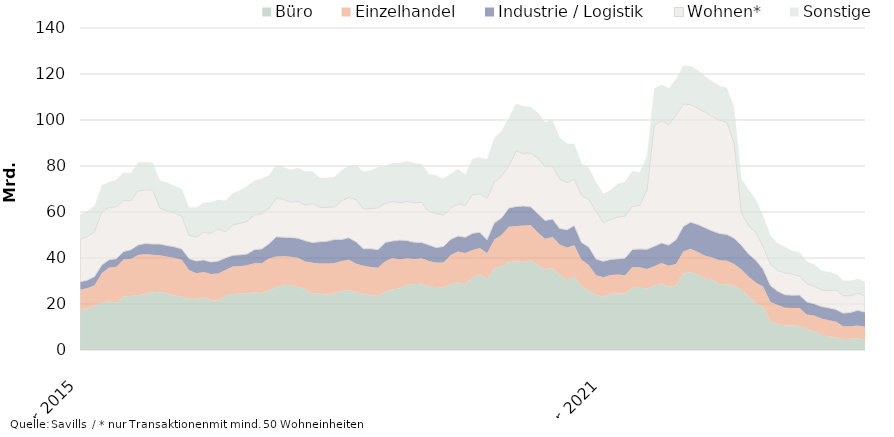
| Category | Büro | Einzelhandel | Industrie / Logistik | Wohnen* | Sonstige |
|---|---|---|---|---|---|
| 2015-03-01 | 17016358031.53 | 9334060176.81 | 3368654245.73 | 18361690467.91 | 10843377202.98 |
| 2015-04-01 | 18244972783.53 | 8600759739.81 | 3468694360.68 | 18935039794.91 | 11184131034.98 |
| 2015-05-01 | 19238000474.45 | 8936850539.31 | 3728635607.68 | 19506582676.91 | 11229798527.98 |
| 2015-06-01 | 20614824085.83 | 12804218553.14 | 3559231021.83 | 23077039312.51 | 11574720193.75 |
| 2015-07-01 | 21080237533.5 | 14814698989.21 | 3371725415.86 | 22644697118.35 | 11143910205.21 |
| 2015-08-01 | 20656625633.5 | 15562941505.21 | 3450767146.86 | 22691607883.35 | 11626767372.21 |
| 2015-09-01 | 23302273453.46 | 16001092585.73 | 3520511283.36 | 22121631489.35 | 12279196997.21 |
| 2015-10-01 | 23501772857.46 | 16181040556.36 | 3919085482.36 | 21349455176.35 | 11987539478.21 |
| 2015-11-01 | 23957423619.14 | 17339041737.5 | 4397719316.13 | 23451887702.29 | 12443601394.38 |
| 2015-12-01 | 24202213697.48 | 17587198961.04 | 4557113724.92 | 23375825542.77 | 11975940305.75 |
| 2016-01-01 | 25139700628.48 | 16270997225.45 | 4662502872.92 | 23334161447.77 | 12028959045.24 |
| 2016-02-01 | 25294714349.53 | 15952090497.99 | 4833139363.87 | 15563498654.77 | 12008953720.01 |
| 2016-03-01 | 24534844202.74 | 15997699828.72 | 4877967507.07 | 15108592339.77 | 12318880326.08 |
| 2016-04-01 | 23667928105.74 | 16386770286.07 | 4833846127.82 | 14760671477.37 | 11756957541.08 |
| 2016-05-01 | 23251081507.82 | 15941944380.07 | 4749671116.82 | 14232081715.37 | 11979556735.04 |
| 2016-06-01 | 22424129844.36 | 12364494883.06 | 4999570420.67 | 10189436595.87 | 12067576140.06 |
| 2016-07-01 | 22113990925.69 | 11257435985.56 | 5312245465.64 | 10404072475.53 | 12817090834.96 |
| 2016-08-01 | 23020503074.69 | 10878738868.56 | 5247332254.55 | 12050427222.53 | 12924367433.96 |
| 2016-09-01 | 21721152253.73 | 11278501725.47 | 5270185116.55 | 12498985369.53 | 13466325785.26 |
| 2016-10-01 | 21376679446.86 | 11872308168.84 | 5398267322.55 | 14009495152.42 | 12815064855.83 |
| 2016-11-01 | 23418913086.76 | 11371816740.7 | 5243284144.73 | 11319606979.49 | 13584628478.66 |
| 2016-12-01 | 24311240228.4 | 11942470429.99 | 4890351002.13 | 13270662270.49 | 13860642419.64 |
| 2017-01-01 | 24509608793.4 | 11953863686.96 | 4924744810.37 | 13669156871.49 | 14439441490.58 |
| 2017-02-01 | 24522929822.41 | 12378572437.09 | 4842785725 | 14207318507.49 | 15399823383.58 |
| 2017-03-01 | 24979801711.4 | 12787832178.37 | 5899654543.8 | 15107380846.79 | 14961863124.58 |
| 2017-04-01 | 24819990861.71 | 12853010576.9 | 6262060580.1 | 15428575157.19 | 15066124285.67 |
| 2017-05-01 | 26232596283.47 | 13514985630.15 | 6483702097.1 | 15461747545.2 | 14297593389.28 |
| 2017-06-01 | 27213166704.1 | 13474043478.5 | 8562546401.46 | 16748341270.79 | 14470141007.56 |
| 2017-07-01 | 28420051498.1 | 12322239347.93 | 8324132158.46 | 16426846580.79 | 13950696505.2 |
| 2017-08-01 | 28135534177.1 | 12429029136.93 | 8386695707.55 | 15389020182.79 | 13979801046.2 |
| 2017-09-01 | 27443892685.45 | 12637830917.94 | 8510058041.55 | 16036484989.78 | 14628427847.74 |
| 2017-10-01 | 26496035870.32 | 11930960273.94 | 9048046430.46 | 15587099126.87 | 14494347450.17 |
| 2017-11-01 | 24585217292.17 | 13335421843.83 | 8802947546.51 | 16954725036.87 | 13991797246.44 |
| 2017-12-01 | 24440717997.53 | 13186078236.48 | 9470343512.7 | 14947735472.87 | 12875205655.48 |
| 2018-01-01 | 24169632440.53 | 13385637745.1 | 9721702683.46 | 14644481680.86 | 12965625420.04 |
| 2018-02-01 | 24532655677.47 | 13346974130.65 | 10213193365.46 | 14254040308.86 | 12991286516.04 |
| 2018-03-01 | 25689146433.48 | 13025014136.64 | 9307934893.46 | 16861797743.49 | 13423676924.02 |
| 2018-04-01 | 26121570226.17 | 13083782210.76 | 9605919650.46 | 17541166648.49 | 13812859535.93 |
| 2018-05-01 | 25059149940.41 | 12454100846.51 | 9488564046.46 | 18390492426.48 | 14988664801.36 |
| 2018-06-01 | 24502115752.78 | 12171900363.34 | 7330050155.1 | 17324340647.56 | 16180804689.08 |
| 2018-07-01 | 23768042590.78 | 12322300226.32 | 7966869588.1 | 17450608751.56 | 16672007493.19 |
| 2018-08-01 | 23510045994.76 | 12247139005.19 | 7892000709.1 | 18148274126.41 | 17798374873.04 |
| 2018-09-01 | 25341157455.41 | 13289291079.55 | 8129841438.1 | 16962704659.42 | 16165594775.21 |
| 2018-10-01 | 26253931201.41 | 13760202882.82 | 7406435586.25 | 17174676866.32 | 16705006538.21 |
| 2018-11-01 | 26888009103.45 | 12507346034.88 | 8394898728.54 | 16108073420.32 | 17423267492.25 |
| 2018-12-01 | 28411133671.45 | 11512722354.68 | 7666795490.35 | 16973956914.32 | 17659710774.26 |
| 2019-01-01 | 28624375832.45 | 10984616615.68 | 7214323719.35 | 17160274095.2 | 17313329869.26 |
| 2019-02-01 | 28937833501.45 | 10992187442.4 | 6831262259.96 | 17513522042.2 | 16557159059.62 |
| 2019-03-01 | 27544432810.45 | 11171202657.26 | 6985219187.16 | 14474272923.27 | 16426926447.64 |
| 2019-04-01 | 27372510768.31 | 10721779269.12 | 6436402186.06 | 14889885528.14 | 16464762534.89 |
| 2019-05-01 | 27086717264.31 | 11007377577.12 | 6927571752.06 | 13578486873.14 | 15944373230.89 |
| 2019-06-01 | 28619667307.82 | 12681145920.09 | 6809920057.06 | 13618351757.47 | 14918333741.96 |
| 2019-07-01 | 29482520307.29 | 13328276761.26 | 6728675032.06 | 14001371322.47 | 15123984896.92 |
| 2019-08-01 | 28588686723.31 | 13581005313.39 | 6860393893.06 | 13736815812.62 | 13482843208.07 |
| 2019-09-01 | 31431753528.25 | 12033999494.97 | 7256389082.92 | 16844554255.62 | 15592958025.83 |
| 2019-10-01 | 32996593890.25 | 11314584887.7 | 6895687562.55 | 16686604858.74 | 15889399476.83 |
| 2019-11-01 | 30747652297.78 | 11283623755.75 | 5893842897.79 | 18035429153.74 | 16938532442.52 |
| 2019-12-01 | 35333825929.49 | 12729233930.88 | 7226755920.45 | 17719972058.74 | 19305302136.48 |
| 2020-01-01 | 36531141461.49 | 13436003498.88 | 7453434361.23 | 18157224812.87 | 19678778754.48 |
| 2020-02-01 | 38099058525.44 | 15499382207.37 | 8153950247.38 | 18363765931.37 | 20828827891.2 |
| 2020-03-01 | 38550852731.89 | 15348353698.15 | 8470739173.18 | 24050048197.37 | 20802783298.78 |
| 2020-04-01 | 38270850851.03 | 15863227930.17 | 8454767344.28 | 22908106646.5 | 20458776349.53 |
| 2020-05-01 | 38881659487.03 | 15503798044.17 | 7865864944.28 | 23336096487.5 | 20137314225.49 |
| 2020-06-01 | 36863967238.52 | 14249892871.21 | 8180845859.28 | 24099048462.5 | 19760014318.42 |
| 2020-07-01 | 35100846656.05 | 13289221607.06 | 7897157112.28 | 23512544941.5 | 19250334168.72 |
| 2020-08-01 | 35666705693.05 | 13410315043.06 | 7903742159.28 | 23019438157.5 | 20371509500.21 |
| 2020-09-01 | 32548010965.11 | 13308117743.68 | 6993249103.42 | 21488103702.49 | 18050626536.08 |
| 2020-10-01 | 30377863654.11 | 14232141322.68 | 7652755535.73 | 20471023725.49 | 17086798953.54 |
| 2020-11-01 | 32272707606.11 | 13317837196.68 | 8500880007.2 | 20188542385.49 | 15400933573.98 |
| 2020-12-01 | 27625165021.4 | 11665823550.74 | 7453393031.54 | 20611432435.49 | 13802815932.88 |
| 2021-01-01 | 25922292644.4 | 11086279196.74 | 7788343257.76 | 20716309315.49 | 13816564859.79 |
| 2021-02-01 | 23909270226.45 | 8616945364.53 | 7050296261 | 20712784697.99 | 12611658548.47 |
| 2021-03-01 | 23103754308 | 8542709511.89 | 6901126684.99 | 16854834848.99 | 12571457775.25 |
| 2021-04-01 | 24445734490 | 8172892560.01 | 6780450405.99 | 17402809013.99 | 12787391550.25 |
| 2021-05-01 | 24556778258 | 8300675545.01 | 6799570666.99 | 18167126016.99 | 14426521004.29 |
| 2021-06-01 | 24564712115 | 7976784992 | 7442419746.99 | 18226182212.99 | 14893365800.91 |
| 2021-07-01 | 27096908880 | 8946495241 | 7685665984.99 | 18785811487.74 | 15380416702.54 |
| 2021-08-01 | 27381485355 | 8588029166 | 7973074710.96 | 18901381563.74 | 14374250615.05 |
| 2021-09-01 | 26583833618 | 8673767815.91 | 8545495709.96 | 25629322018.75 | 14806322793.41 |
| 2021-10-01 | 27976146105.69 | 8385660425.91 | 8750582399.96 | 52501286139.75 | 16203607137.32 |
| 2021-11-01 | 28869809103.69 | 8903617601.91 | 8755552913.96 | 53116738980.75 | 15682010779.88 |
| 2021-12-01 | 27486490912.69 | 9091146920.86 | 9058724684.96 | 52306052488.25 | 15911718226.98 |
| 2022-01-01 | 28031135110.69 | 9315774980.07 | 10564640071.97 | 54152314759.25 | 15815971210.07 |
| 2022-02-01 | 33207067958.24 | 9592118324.13 | 10884960143.97 | 53241290616.79 | 16686139999.17 |
| 2022-03-01 | 33946785395.27 | 10065682922.43 | 11570573114.93 | 51107123050.79 | 16747285170.48 |
| 2022-04-01 | 32664499595.27 | 9945157957.43 | 11993854151.93 | 50503999418.79 | 16663945475.48 |
| 2022-05-01 | 31125193747.27 | 9878526536.43 | 12156046280.93 | 50270647458.79 | 15528955696.48 |
| 2022-06-01 | 30599994788.74 | 9654726857.42 | 11522419839.93 | 49707368541.79 | 15318436387.32 |
| 2022-07-01 | 28678258351.74 | 10395369164.8 | 11552338908.93 | 49231995043.04 | 15001577672.32 |
| 2022-08-01 | 28623980028.74 | 10186491398.8 | 11445785093.96 | 48711417034.02 | 15034757196.32 |
| 2022-09-01 | 27784288953.74 | 9632330188.89 | 11196978657.96 | 41148135072.17 | 15807249733.27 |
| 2022-10-01 | 26111579119.05 | 8901542364.89 | 10532370813.96 | 14109575596.17 | 14768461087.88 |
| 2022-11-01 | 23352831057.49 | 8443326908.89 | 9881801612.96 | 12298496042.17 | 15703391925.8 |
| 2022-12-01 | 20211163559.49 | 9142239345.94 | 9652007449.94 | 12150611492.67 | 14213710249.84 |
| 2023-01-01 | 18780895172.49 | 8725890743.73 | 7496504559.93 | 9699649565.65 | 13433592381.84 |
| 2023-02-01 | 12490315896.94 | 8415580292.67 | 7078973358.93 | 9335553360.11 | 12411037027.98 |
| 2023-03-01 | 11256081460.91 | 8315622099.37 | 6010959284.98 | 9054825734.11 | 11767948193.31 |
| 2023-04-01 | 10683362085.91 | 7669045935.37 | 5665394287.98 | 9530698016.53 | 11246523542.31 |
| 2023-05-01 | 10633502484.91 | 7618861499.37 | 5603325227.98 | 9108479222.53 | 10177566551.31 |
| 2023-06-01 | 10294412987.44 | 8003181317.37 | 5581733960.95 | 8245407543.53 | 10389655265.85 |
| 2023-07-01 | 9257206588.44 | 6139595299.99 | 5472679568.92 | 7958623413.29 | 9675339565.85 |
| 2023-08-01 | 8110622411.44 | 6904398653.29 | 5117810292.92 | 7641044836.31 | 9428000534.85 |
| 2023-09-01 | 6677025956.44 | 7009806136.29 | 5231318723.92 | 7259636172.16 | 8531149970.9 |
| 2023-10-01 | 5989961773.44 | 6960796772.29 | 5411649029.9 | 7420197986.16 | 8091981203.92 |
| 2023-11-01 | 5446695337 | 6947967180.29 | 5232888564.9 | 8430875484.01 | 7107118593 |
| 2023-12-01 | 4722768457 | 5652445195.29 | 5637283565.87 | 7641925882.01 | 6580897200 |
| 2024-01-01 | 4852852846 | 5423114916.29 | 6050175304.87 | 7248308534.03 | 6525651793 |
| 2024-02-01 | 5057658774 | 5628243052.29 | 6546338924.87 | 7508131192.03 | 6209111293 |
| 2024-03-01 | 4492972294 | 5562786907.29 | 6427836556.87 | 7015066822.03 | 6221365930 |